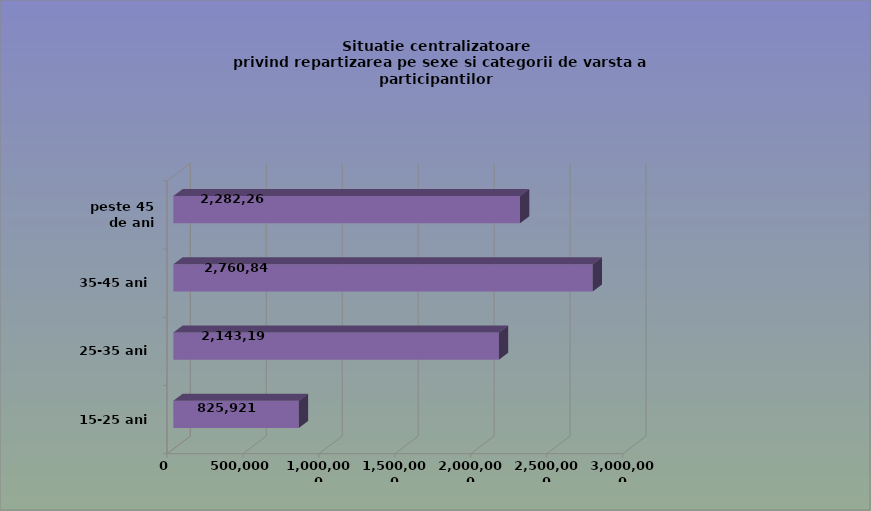
| Category | 15-25 ani 25-35 ani 35-45 ani peste 45 de ani |
|---|---|
| 15-25 ani | 825921 |
| 25-35 ani | 2143192 |
| 35-45 ani | 2760848 |
| peste 45 de ani | 2282265 |